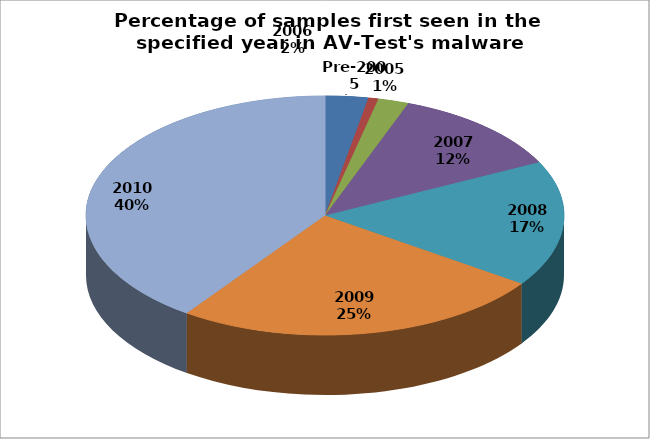
| Category | Series 0 |
|---|---|
| Pre-2005 | 1431140 |
| 2005 | 333807 |
| 2006 | 1022897 |
| 2007 | 5917499 |
| 2008 | 8378932 |
| 2009 | 12396834 |
| 2010 | 19814232 |